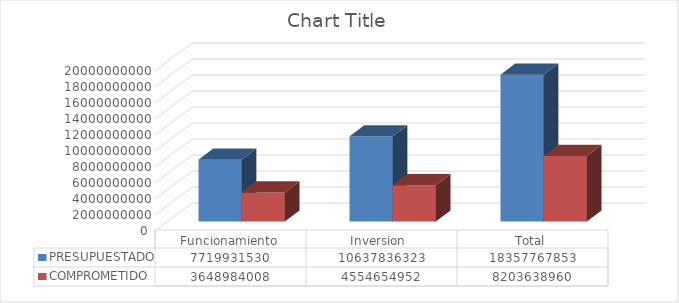
| Category | PRESUPUESTADO | COMPROMETIDO |
|---|---|---|
| Funcionamiento | 7719931530 | 3648984008.25 |
| Inversion  | 10637836323 | 4554654951.5 |
| Total | 18357767853 | 8203638959.75 |